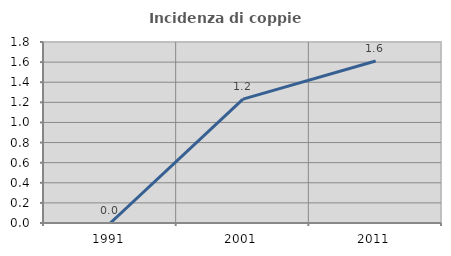
| Category | Incidenza di coppie miste |
|---|---|
| 1991.0 | 0 |
| 2001.0 | 1.232 |
| 2011.0 | 1.611 |